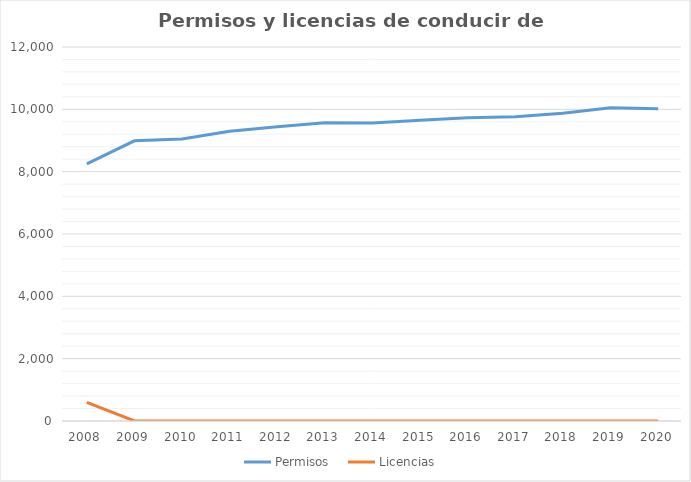
| Category | Permisos | Licencias |
|---|---|---|
| 2008 | 8251 | 595 |
| 2009 | 8989 | 2 |
| 2010 | 9051 | 2 |
| 2011 | 9300 | 2 |
| 2012 | 9438 | 2 |
| 2013 | 9571 | 2 |
| 2014 | 9564 | 2 |
| 2015 | 9652 | 2 |
| 2016 | 9731 | 1 |
| 2017 | 9761 | 1 |
| 2018 | 9871 | 1 |
| 2019 | 10051 | 1 |
| 2020 | 10019 | 1 |